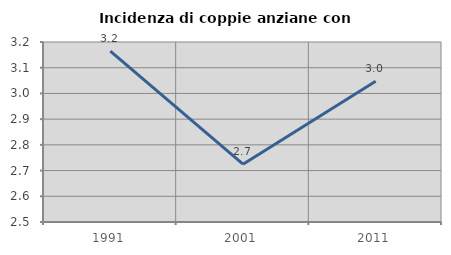
| Category | Incidenza di coppie anziane con figli |
|---|---|
| 1991.0 | 3.165 |
| 2001.0 | 2.725 |
| 2011.0 | 3.047 |